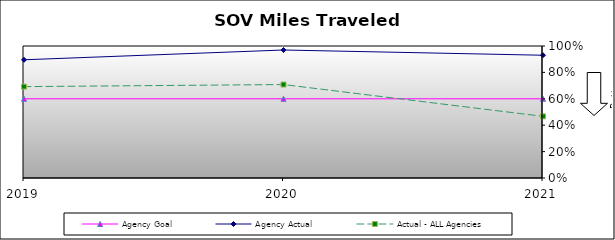
| Category | Agency Goal | Agency Actual | Actual - ALL Agencies |
|---|---|---|---|
| 2019.0 | 0.6 | 0.896 | 0.692 |
| 2020.0 | 0.6 | 0.97 | 0.708 |
| 2021.0 | 0.6 | 0.93 | 0.467 |